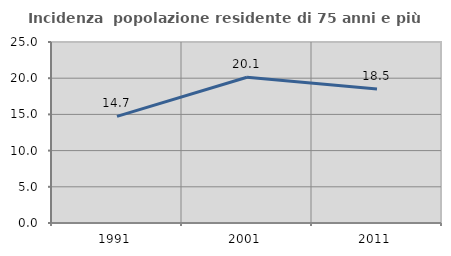
| Category | Incidenza  popolazione residente di 75 anni e più |
|---|---|
| 1991.0 | 14.724 |
| 2001.0 | 20.134 |
| 2011.0 | 18.519 |